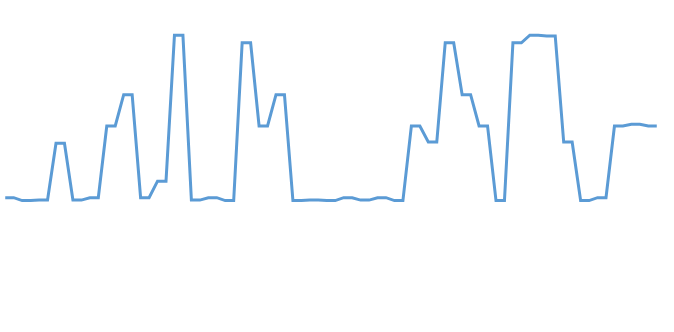
| Category | Series 0 |
|---|---|
| 0.0 | 58.995 |
| 1.0 | 58.995 |
| 3.25 | 58.922 |
| 19.75 | 58.922 |
| 20.0 | 58.935 |
| 26.0 | 58.935 |
| 41.916669999999996 | 60.374 |
| 52.246669999999995 | 60.374 |
| 63.246669999999995 | 58.935 |
| 80.74667 | 58.935 |
| 81.74667 | 58.995 |
| 94.74667 | 58.995 |
| 111.74667 | 60.811 |
| 116.74667 | 60.811 |
| 123.14667 | 61.602 |
| 129.47667 | 61.602 |
| 150.47667 | 58.995 |
| 152.97667 | 58.995 |
| 156.52667000000002 | 59.414 |
| 159.02667000000002 | 59.414 |
| 187.82667000000004 | 63.11 |
| 251.24667000000005 | 63.11 |
| 286.24667000000005 | 58.935 |
| 300.66667000000007 | 58.935 |
| 302.16667000000007 | 58.995 |
| 311.0866700000001 | 58.995 |
| 312.7866700000001 | 58.922 |
| 340.9566700000001 | 58.922 |
| 345.0566700000001 | 62.918 |
| 347.8866700000001 | 62.918 |
| 351.8866700000001 | 60.811 |
| 363.3866700000001 | 60.811 |
| 369.3866700000001 | 61.602 |
| 372.8066700000001 | 61.602 |
| 391.8066700000001 | 58.922 |
| 392.4766700000001 | 58.922 |
| 392.7266700000001 | 58.935 |
| 395.9766700000001 | 58.935 |
| 397.27667000000014 | 58.922 |
| 402.6066700000001 | 58.922 |
| 404.1066700000001 | 58.995 |
| 406.1066700000001 | 58.995 |
| 413.6066700000001 | 58.935 |
| 415.8566700000001 | 58.935 |
| 417.6066700000001 | 58.995 |
| 420.1066700000001 | 58.995 |
| 421.8066700000001 | 58.922 |
| 430.0566700000001 | 58.922 |
| 444.2566700000001 | 60.811 |
| 457.1766700000001 | 60.811 |
| 461.6766700000001 | 60.404 |
| 464.09667000000013 | 60.404 |
| 466.09667000000013 | 62.918 |
| 470.4266700000001 | 62.918 |
| 479.4266700000001 | 61.602 |
| 484.4266700000001 | 61.602 |
| 491.4266700000001 | 60.811 |
| 493.9266700000001 | 60.811 |
| 509.1266700000001 | 58.922 |
| 532.1266700000001 | 58.922 |
| 561.3266700000001 | 62.918 |
| 590.5766700000001 | 62.918 |
| 615.0766700000001 | 63.11 |
| 620.4066700000002 | 63.11 |
| 620.9066700000002 | 63.089 |
| 626.6566700000002 | 63.089 |
| 650.1566700000002 | 60.404 |
| 658.2366700000002 | 60.404 |
| 669.7366700000002 | 58.922 |
| 674.7366700000002 | 58.922 |
| 676.4866700000002 | 58.995 |
| 685.1066700000002 | 58.995 |
| 698.8566700000002 | 60.811 |
| 707.4366700000003 | 60.811 |
| 708.9366700000003 | 60.855 |
| 713.6866700000003 | 60.855 |
| 717.3366700000003 | 60.811 |
| 735.4366700000003 | 60.811 |